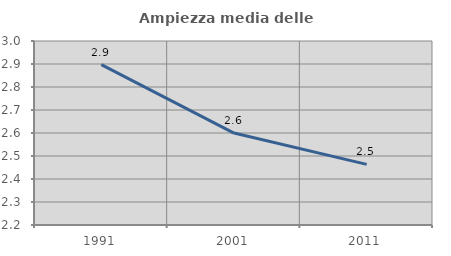
| Category | Ampiezza media delle famiglie |
|---|---|
| 1991.0 | 2.897 |
| 2001.0 | 2.6 |
| 2011.0 | 2.464 |